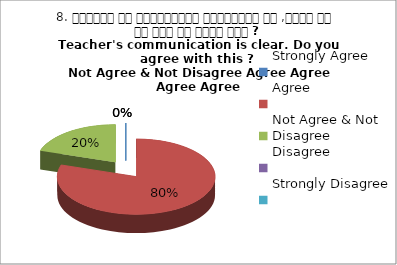
| Category | 8. शिक्षक का सम्प्रेषण सुस्पष्ठ है ,क्या आप इस बात से सहमत हैं ?
Teacher's communication is clear. Do you agree with this ? 
 Not Agree & Not Disagree Agree Agree Agree Agree |
|---|---|
| Strongly Agree | 0 |
| Agree | 4 |
| Not Agree & Not Disagree | 1 |
| Disagree | 0 |
| Strongly Disagree | 0 |